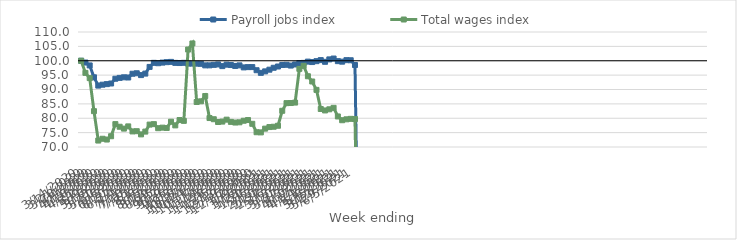
| Category | Payroll jobs index | Total wages index |
|---|---|---|
| 14/03/2020 | 100 | 100 |
| 21/03/2020 | 99.376 | 95.781 |
| 28/03/2020 | 98.371 | 93.957 |
| 04/04/2020 | 94.241 | 82.464 |
| 11/04/2020 | 91.354 | 72.24 |
| 18/04/2020 | 91.67 | 72.865 |
| 25/04/2020 | 91.874 | 72.596 |
| 02/05/2020 | 92.091 | 73.746 |
| 09/05/2020 | 93.742 | 77.96 |
| 16/05/2020 | 94.039 | 77.044 |
| 23/05/2020 | 94.24 | 76.4 |
| 30/05/2020 | 94.175 | 77.17 |
| 06/06/2020 | 95.483 | 75.42 |
| 13/06/2020 | 95.647 | 75.499 |
| 20/06/2020 | 95.006 | 74.391 |
| 27/06/2020 | 95.532 | 75.357 |
| 04/07/2020 | 97.853 | 77.795 |
| 11/07/2020 | 99.274 | 77.956 |
| 18/07/2020 | 99.138 | 76.538 |
| 25/07/2020 | 99.356 | 76.733 |
| 01/08/2020 | 99.508 | 76.621 |
| 08/08/2020 | 99.606 | 78.796 |
| 15/08/2020 | 99.257 | 77.517 |
| 22/08/2020 | 99.205 | 79.374 |
| 29/08/2020 | 99.281 | 79.088 |
| 05/09/2020 | 99.009 | 103.897 |
| 12/09/2020 | 99.014 | 106.016 |
| 19/09/2020 | 98.985 | 85.651 |
| 26/09/2020 | 98.934 | 85.894 |
| 03/10/2020 | 98.394 | 87.733 |
| 10/10/2020 | 98.398 | 80.074 |
| 17/10/2020 | 98.571 | 79.658 |
| 24/10/2020 | 98.712 | 78.691 |
| 31/10/2020 | 98.131 | 78.838 |
| 07/11/2020 | 98.644 | 79.507 |
| 14/11/2020 | 98.508 | 78.738 |
| 21/11/2020 | 98.19 | 78.509 |
| 28/11/2020 | 98.39 | 78.59 |
| 05/12/2020 | 97.689 | 79.136 |
| 12/12/2020 | 97.785 | 79.379 |
| 19/12/2020 | 97.799 | 78.063 |
| 26/12/2020 | 96.706 | 75.139 |
| 02/01/2021 | 95.79 | 75.08 |
| 09/01/2021 | 96.306 | 76.39 |
| 16/01/2021 | 96.893 | 76.939 |
| 23/01/2021 | 97.56 | 77.047 |
| 30/01/2021 | 98 | 77.389 |
| 06/02/2021 | 98.529 | 82.594 |
| 13/02/2021 | 98.592 | 85.257 |
| 20/02/2021 | 98.323 | 85.294 |
| 27/02/2021 | 98.702 | 85.452 |
| 06/03/2021 | 99.217 | 97.182 |
| 13/03/2021 | 99.253 | 98.235 |
| 20/03/2021 | 99.698 | 94.603 |
| 27/03/2021 | 99.546 | 92.786 |
| 03/04/2021 | 99.855 | 89.867 |
| 10/04/2021 | 100.22 | 83.22 |
| 17/04/2021 | 99.635 | 82.717 |
| 24/04/2021 | 100.472 | 83.11 |
| 01/05/2021 | 100.769 | 83.622 |
| 08/05/2021 | 99.861 | 80.624 |
| 15/05/2021 | 99.683 | 79.314 |
| 22/05/2021 | 100.208 | 79.628 |
| 29/05/2021 | 100.17 | 79.79 |
| 05/06/2021 | 98.517 | 79.728 |